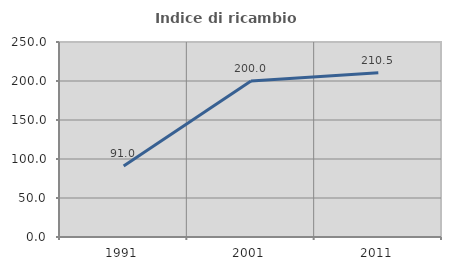
| Category | Indice di ricambio occupazionale  |
|---|---|
| 1991.0 | 90.955 |
| 2001.0 | 200 |
| 2011.0 | 210.458 |